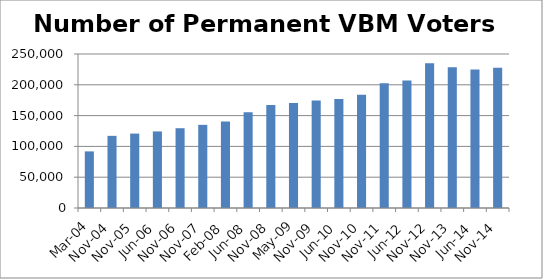
| Category | Number of Permanent VBM Voters |
|---|---|
| Mar-04 | 91889 |
| Nov-04 | 117132 |
| Nov-05 | 120813 |
| Jun-06 | 124323 |
| Nov-06 | 129523 |
| Nov-07 | 134997 |
| Feb-08 | 140579 |
| Jun-08 | 155245 |
| Nov-08 | 167148 |
| May-09 | 170282 |
| Nov-09 | 174383 |
| Jun-10 | 176983 |
| Nov-10 | 183733 |
| Nov-11 | 202388 |
| Jun-12 | 206921 |
| Nov-12 | 235106 |
| Nov-13 | 228533 |
| Jun-14 | 225008 |
| Nov-14 | 227732 |